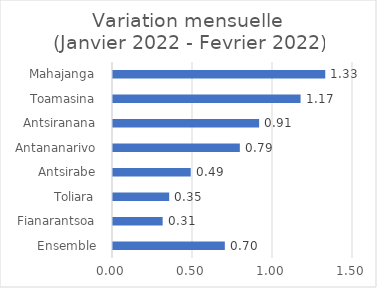
| Category | Glissement mensuel |
|---|---|
|  Ensemble  | 0.699 |
|  Fianarantsoa  | 0.31 |
|  Toliara  | 0.351 |
|  Antsirabe  | 0.486 |
|  Antananarivo  | 0.793 |
|  Antsiranana  | 0.913 |
|  Toamasina  | 1.172 |
|  Mahajanga  | 1.327 |